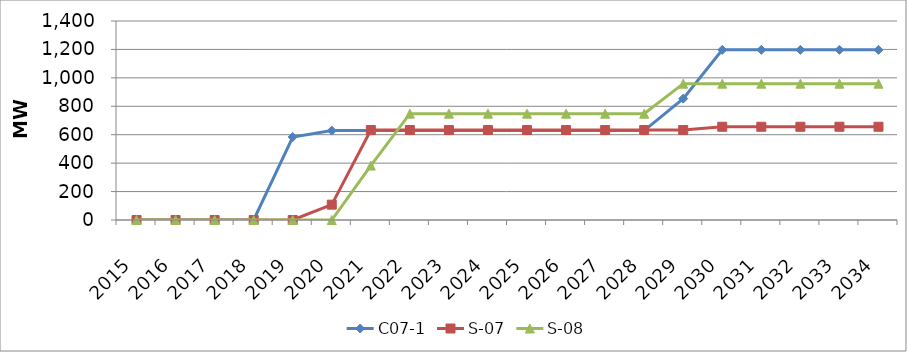
| Category | C07-1 | S-07 | S-08 |
|---|---|---|---|
| 2015.0 | 0 | 0 | 0 |
| 2016.0 | 0 | 0 | 0 |
| 2017.0 | 0 | 0 | 0 |
| 2018.0 | 0 | 0 | 0 |
| 2019.0 | 584 | 0 | 0 |
| 2020.0 | 629 | 108 | 0 |
| 2021.0 | 629 | 633 | 383 |
| 2022.0 | 629 | 633 | 748 |
| 2023.0 | 629 | 633 | 748 |
| 2024.0 | 629 | 633 | 748 |
| 2025.0 | 629 | 633 | 748 |
| 2026.0 | 629 | 633 | 748 |
| 2027.0 | 629 | 633 | 748 |
| 2028.0 | 629 | 633 | 748 |
| 2029.0 | 854 | 633 | 959 |
| 2030.0 | 1197 | 656 | 959 |
| 2031.0 | 1197 | 656 | 959 |
| 2032.0 | 1197 | 656 | 959 |
| 2033.0 | 1197 | 656 | 959 |
| 2034.0 | 1197 | 656 | 959 |